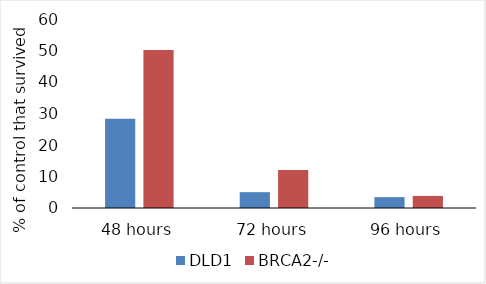
| Category | DLD1 | BRCA2-/- |
|---|---|---|
| 48 hours | 28.336 | 50.128 |
| 72 hours | 5.025 | 12.046 |
| 96 hours | 3.45 | 3.833 |